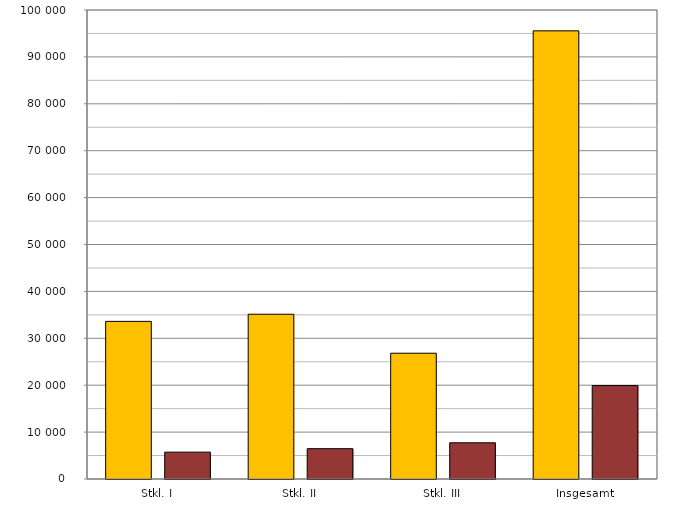
| Category | Steuerpflichtiger
Erwerb | Festgesetzte
Steuer |
|---|---|---|
| Stkl. I | 33607 | 5729 |
| Stkl. II | 35129 | 6467 |
| Stkl. III | 26818 | 7717 |
| Insgesamt | 95554 | 19913 |